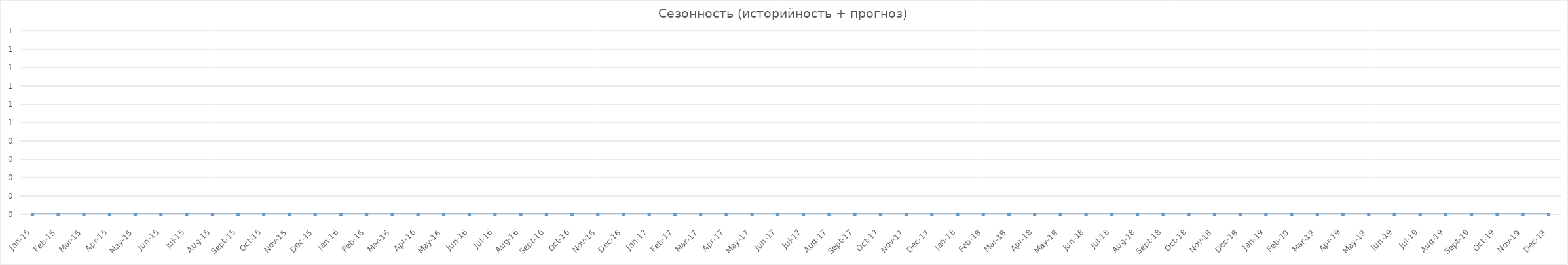
| Category | Сезонность | Прогноз сезонности |
|---|---|---|
| 2015-01-01 | 0 |  |
| 2015-02-01 | 0 |  |
| 2015-03-01 | 0 |  |
| 2015-04-01 | 0 |  |
| 2015-05-01 | 0 |  |
| 2015-06-01 | 0 |  |
| 2015-07-01 | 0 |  |
| 2015-08-01 | 0 |  |
| 2015-09-01 | 0 |  |
| 2015-10-01 | 0 |  |
| 2015-11-01 | 0 |  |
| 2015-12-01 | 0 |  |
| 2016-01-01 | 0 |  |
| 2016-02-01 | 0 |  |
| 2016-03-01 | 0 |  |
| 2016-04-01 | 0 |  |
| 2016-05-01 | 0 |  |
| 2016-06-01 | 0 |  |
| 2016-07-01 | 0 |  |
| 2016-08-01 | 0 |  |
| 2016-09-01 | 0 |  |
| 2016-10-01 | 0 |  |
| 2016-11-01 | 0 |  |
| 2016-12-01 | 0 |  |
| 2017-01-01 | 0 |  |
| 2017-02-01 | 0 |  |
| 2017-03-01 | 0 |  |
| 2017-04-01 | 0 |  |
| 2017-05-01 | 0 |  |
| 2017-06-01 | 0 |  |
| 2017-07-01 | 0 |  |
| 2017-08-01 | 0 |  |
| 2017-09-01 | 0 |  |
| 2017-10-01 | 0 |  |
| 2017-11-01 | 0 |  |
| 2017-12-01 | 0 |  |
| 2018-01-01 | 0 |  |
| 2018-02-01 | 0 |  |
| 2018-03-01 | 0 |  |
| 2018-04-01 | 0 |  |
| 2018-05-01 | 0 |  |
| 2018-06-01 | 0 |  |
| 2018-07-01 | 0 |  |
| 2018-08-01 | 0 |  |
| 2018-09-01 | 0 |  |
| 2018-10-01 | 0 |  |
| 2018-11-01 | 0 |  |
| 2018-12-01 | 0 |  |
| 2019-01-01 | 0 |  |
| 2019-02-01 | 0 |  |
| 2019-03-01 | 0 |  |
| 2019-04-01 | 0 |  |
| 2019-05-01 | 0 |  |
| 2019-06-01 | 0 |  |
| 2019-07-01 | 0 |  |
| 2019-08-01 | 0 |  |
| 2019-09-01 | 0 |  |
| 2019-10-01 | 0 |  |
| 2019-11-01 | 0 |  |
| 2019-12-01 | 0 |  |